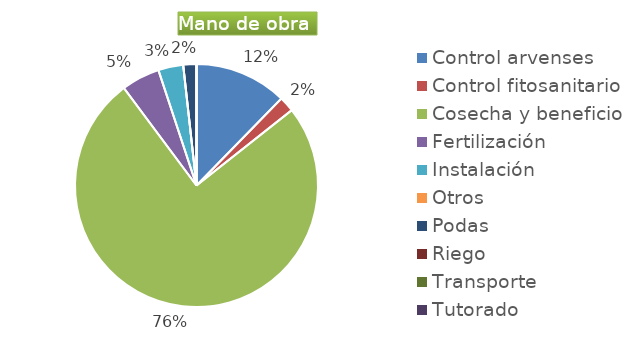
| Category | Series 0 |
|---|---|
| Control arvenses | 10680878 |
| Control fitosanitario | 1774864 |
| Cosecha y beneficio | 65496372 |
| Fertilización | 4437160 |
| Instalación | 2884154 |
| Otros | 0 |
| Podas | 1521312 |
| Riego | 0 |
| Transporte | 0 |
| Tutorado | 0 |